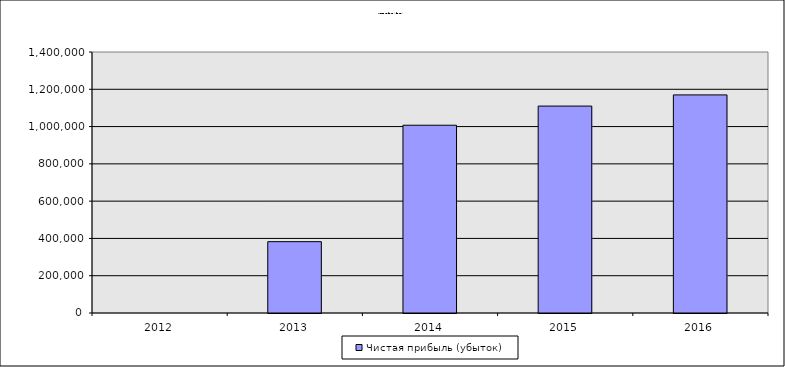
| Category | Чистая прибыль (убыток) |
|---|---|
| 2012.0 | 0 |
| 2013.0 | 382641.794 |
| 2014.0 | 1007099.904 |
| 2015.0 | 1109885.293 |
| 2016.0 | 1169856.831 |